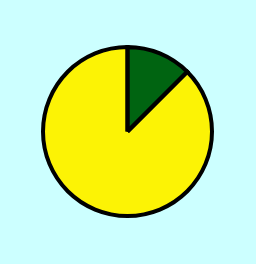
| Category | Series 0 | Series 1 |
|---|---|---|
| 0 | 1 | 1 |
| 1 | 7 | 7 |